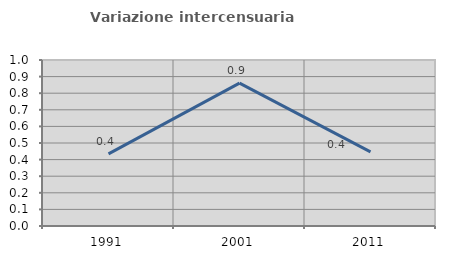
| Category | Variazione intercensuaria annua |
|---|---|
| 1991.0 | 0.435 |
| 2001.0 | 0.861 |
| 2011.0 | 0.447 |